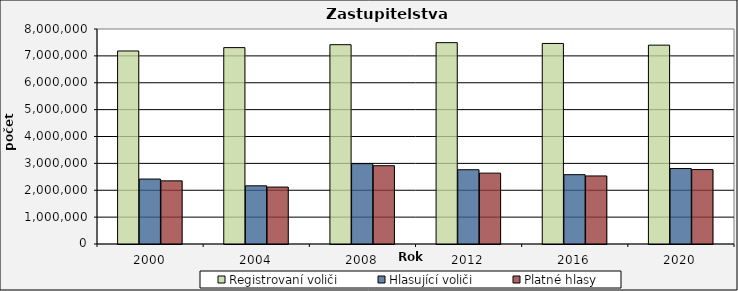
| Category | Registrovaní voliči | Hlasující voliči | Platné hlasy |
|---|---|---|---|
| 2000.0 | 7182503 | 2416385 | 2349124 |
| 2004.0 | 7307378 | 2164456 | 2117443 |
| 2008.0 | 7415830 | 2988487 | 2913642 |
| 2012.0 | 7491806 | 2763464 | 2637115 |
| 2016.0 | 7461766 | 2579668 | 2532311 |
| 2020.0 | 7399299 | 2807967 | 2769361 |